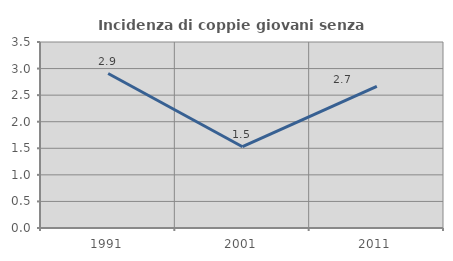
| Category | Incidenza di coppie giovani senza figli |
|---|---|
| 1991.0 | 2.907 |
| 2001.0 | 1.529 |
| 2011.0 | 2.667 |